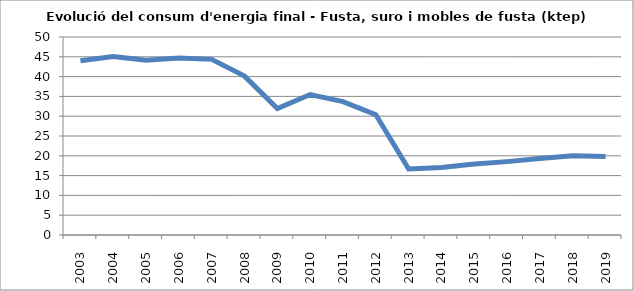
| Category | 44,0 |
|---|---|
| 2003.0 | 43.99 |
| 2004.0 | 45.05 |
| 2005.0 | 44.11 |
| 2006.0 | 44.7 |
| 2007.0 | 44.35 |
| 2008.0 | 40.12 |
| 2009.0 | 31.93 |
| 2010.0 | 35.47 |
| 2011.0 | 33.69 |
| 2012.0 | 30.37 |
| 2013.0 | 16.66 |
| 2014.0 | 17.03 |
| 2015.0 | 17.93 |
| 2016.0 | 18.53 |
| 2017.0 | 19.31 |
| 2018.0 | 20.01 |
| 2019.0 | 19.8 |